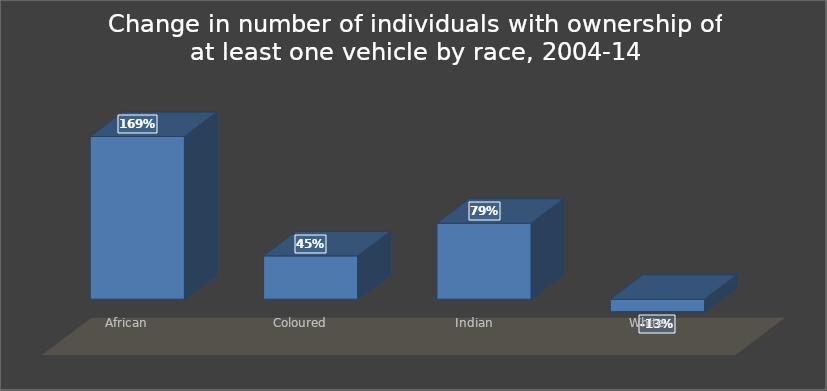
| Category | Series 0 |
|---|---|
| African | 1.69 |
| Coloured | 0.45 |
| Indian | 0.79 |
| White | -0.13 |